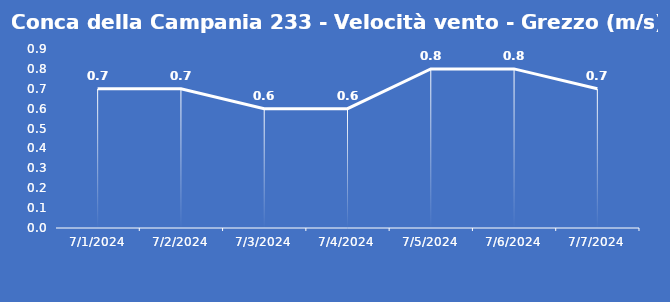
| Category | Conca della Campania 233 - Velocità vento - Grezzo (m/s) |
|---|---|
| 7/1/24 | 0.7 |
| 7/2/24 | 0.7 |
| 7/3/24 | 0.6 |
| 7/4/24 | 0.6 |
| 7/5/24 | 0.8 |
| 7/6/24 | 0.8 |
| 7/7/24 | 0.7 |